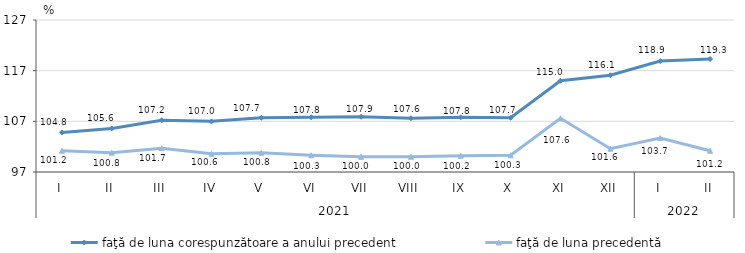
| Category | faţă de luna corespunzătoare a anului precedent | faţă de luna precedentă   |
|---|---|---|
| 0 | 104.8 | 101.2 |
| 1 | 105.6 | 100.8 |
| 2 | 107.2 | 101.7 |
| 3 | 107 | 100.6 |
| 4 | 107.7 | 100.8 |
| 5 | 107.8 | 100.3 |
| 6 | 107.9 | 100 |
| 7 | 107.6 | 100 |
| 8 | 107.8 | 100.2 |
| 9 | 107.7 | 100.3 |
| 10 | 115 | 107.6 |
| 11 | 116.1 | 101.6 |
| 12 | 118.9 | 103.7 |
| 13 | 119.3 | 101.2 |